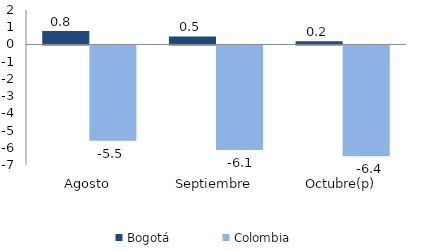
| Category | Bogotá | Colombia |
|---|---|---|
| Agosto | 0.779 | -5.529 |
| Septiembre | 0.462 | -6.068 |
| Octubre(p) | 0.182 | -6.435 |